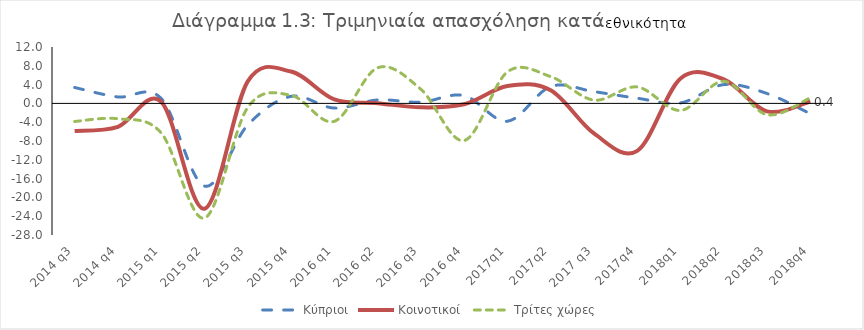
| Category | Κύπριοι | Κοινοτικοί  | Τρίτες χώρες |
|---|---|---|---|
| 2014 q3 | 3.385 | -5.852 | -3.846 |
| 2014 q4 | 1.367 | -4.99 | -3.269 |
| 2015 q1 | 1.057 | 0.357 | -6.28 |
| 2015 q2 | -17.6 | -22.4 | -24.4 |
| 2015 q3 | -4.591 | 4.677 | -0.86 |
| 2015 q4 | 1.499 | 6.772 | 1.731 |
| 2016 q1 | -0.996 | 0.854 | -3.815 |
| 2016 q2 | 0.732 | 0.049 | 7.584 |
| 2016 q3 | 0.26 | -0.835 | 3.003 |
| 2016 q4 | 1.664 | -0.194 | -7.9 |
| 2017q1 | -3.8 | 3.7 | 6.7 |
| 2017q2 | 3.6 | 2.8 | 5.7 |
| 2017 q3 | 2.5 | -6.4 | 0.7 |
| 2017q4 | 1.1 | -10.1 | 3.5 |
| 2018q1 | 0.1 | 5.3 | -1.5 |
| 2018q2 | 4 | 5.1 | 4.7 |
| 2018q3 | 2.1 | -1.7 | -2.4 |
| 2018q4 | -2.2 | 0.4 | 1.2 |